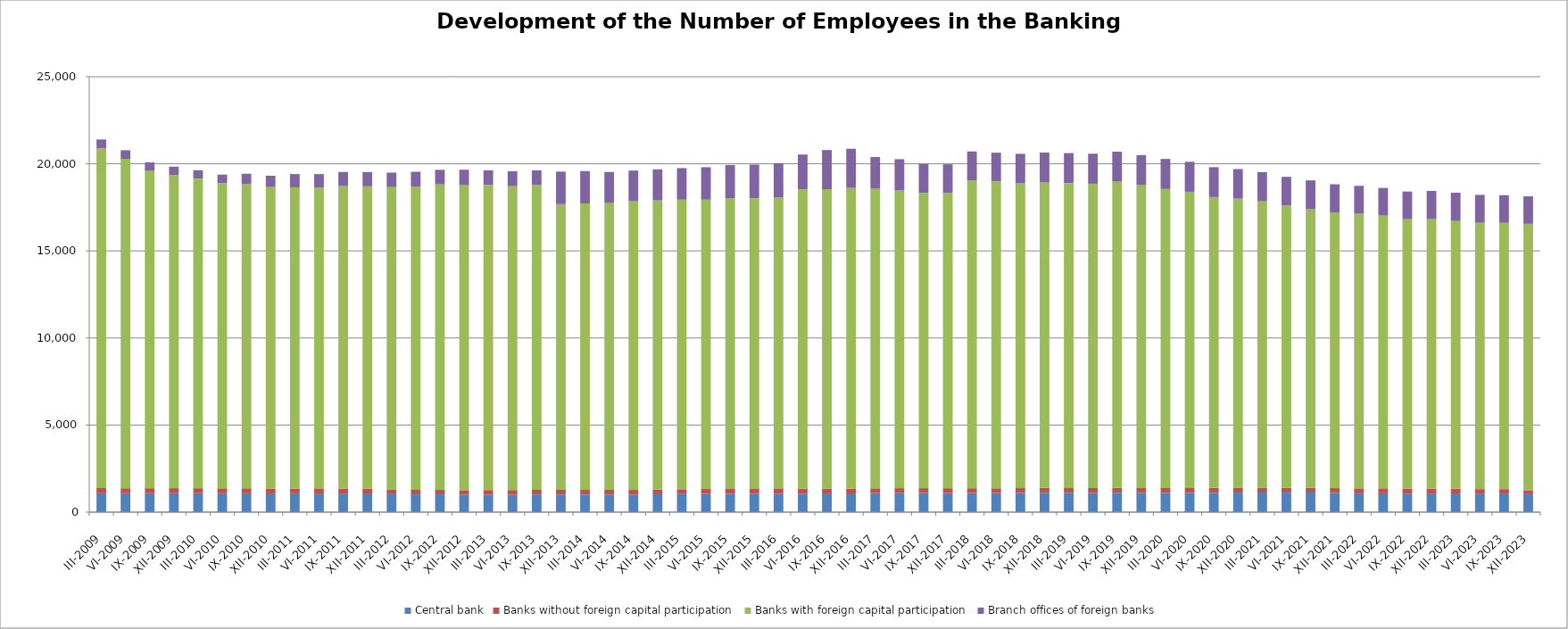
| Category | Central bank | Banks without foreign capital participation | Banks with foreign capital participation | Branch offices of foreign banks |
|---|---|---|---|---|
| III-2009 | 1084 | 301 | 19495 | 518 |
| VI-2009 | 1086 | 286 | 18910 | 498 |
| IX-2009 | 1088 | 285 | 18218 | 490 |
| XII-2009 | 1086 | 291 | 17975 | 484 |
| III-2010 | 1089 | 286 | 17776 | 483 |
| VI-2010 | 1085 | 284 | 17526 | 485 |
| IX-2010 | 1083 | 285 | 17461 | 600 |
| XII-2010 | 1079 | 264 | 17323 | 647 |
| III-2011 | 1082 | 261 | 17308 | 760 |
| VI-2011 | 1070 | 267 | 17294 | 779 |
| IX-2011 | 1072 | 270 | 17382 | 807 |
| XII-2011 | 1075 | 267 | 17366 | 819 |
| III-2012 | 1033 | 265 | 17369 | 827 |
| VI-2012 | 1020 | 263 | 17416 | 843 |
| IX-2012 | 1021 | 257 | 17545 | 833 |
| XII-2012 | 1007 | 253 | 17516 | 886 |
| III-2013 | 1003 | 268 | 17511 | 846 |
| VI-2013 | 1001 | 268 | 17451 | 856 |
| IX-2013 | 1013 | 271 | 17492 | 847 |
| XII-2013 | 1011 | 275 | 16399 | 1866 |
| III-2014 | 1008 | 277 | 16442 | 1857 |
| VI-2014 | 1007 | 273 | 16492 | 1758 |
| IX-2014 | 1001 | 277 | 16584 | 1751 |
| XII-2014 | 1027 | 274 | 16596 | 1786 |
| III-2015 | 1034 | 280 | 16627 | 1811 |
| VI-2015 | 1049 | 279 | 16615 | 1862 |
| IX-2015 | 1056 | 280 | 16680 | 1915 |
| XII-2015 | 1053 | 277 | 16696 | 1927 |
| III-2016 | 1055 | 277 | 16734 | 1973 |
| VI-2016 | 1063 | 279 | 17191 | 1999 |
| IX-2016 | 1072 | 284 | 17186 | 2249 |
| XII-2016 | 1075 | 277 | 17261 | 2250 |
| III-2017 | 1094 | 275 | 17199 | 1821 |
| VI-2017 | 1102 | 275 | 17084 | 1803 |
| IX-2017 | 1101 | 276 | 16954 | 1662 |
| XII-2017 | 1093 | 282 | 16953 | 1644 |
| III-2018 | 1097 | 277 | 17670 | 1665 |
| VI-2018 | 1097 | 272 | 17628 | 1641 |
| IX-2018 | 1102 | 277 | 17500 | 1694 |
| XII-2018 | 1110 | 281 | 17539 | 1719 |
| III-2019 | 1111 | 276 | 17509 | 1719 |
| VI-2019 | 1105 | 280 | 17472 | 1724 |
| IX-2019 | 1114 | 279 | 17585 | 1717 |
| XII-2019 | 1109 | 280 | 17407 | 1706 |
| III-2020 | 1105 | 278 | 17174 | 1722 |
| VI-2020 | 1109 | 279 | 17008 | 1720 |
| IX-2020 | 1112 | 279 | 16701 | 1715 |
| XII-2020 | 1122 | 277 | 16599 | 1700 |
| III-2021 | 1125 | 277 | 16444 | 1679 |
| VI-2021 | 1120 | 276 | 16206 | 1649 |
| IX-2021 | 1128 | 277 | 15995 | 1649 |
| XII-2021 | 1108 | 272 | 15818 | 1627 |
| III-2022 | 1083 | 281 | 15772 | 1600 |
| VI-2022 | 1082 | 284 | 15661 | 1588 |
| IX-2022 | 1064 | 279 | 15478 | 1587 |
| XII-2022 | 1070 | 270 | 15481 | 1621 |
| III-2023 | 1076 | 264 | 15381 | 1621 |
| VI-2023 | 1069 | 256 | 15288 | 1604 |
| IX-2023 | 1072 | 252 | 15288 | 1586 |
| XII-2023 | 1073 | 181 | 15301 | 1577 |